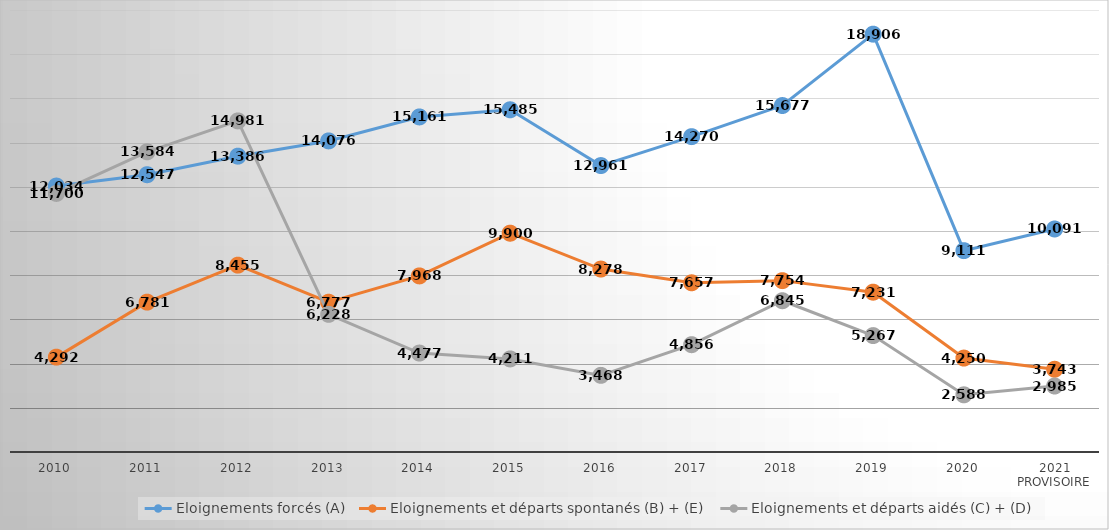
| Category | Eloignements forcés (A) | Eloignements et départs spontanés (B) + (E) | Eloignements et départs aidés (C) + (D) |
|---|---|---|---|
| 2010 | 12034 | 4292 | 11700 |
| 2011 | 12547 | 6781 | 13584 |
| 2012 | 13386 | 8455 | 14981 |
| 2013 | 14076 | 6777 | 6228 |
| 2014 | 15161 | 7968 | 4477 |
| 2015 | 15485 | 9900 | 4211 |
| 2016 | 12961 | 8278 | 3468 |
| 2017 | 14270 | 7657 | 4856 |
| 2018 | 15677 | 7754 | 6845 |
| 2019 | 18906 | 7231 | 5267 |
| 2020 | 9111 | 4250 | 2588 |
| 2021 provisoire | 10091 | 3743 | 2985 |